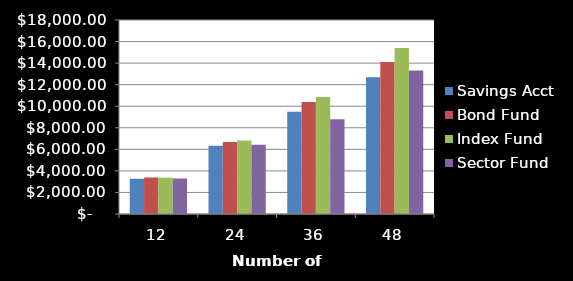
| Category | Savings Acct | Bond Fund | Index Fund | Sector Fund |
|---|---|---|---|---|
| 12.0 | 3270.39 | 3385.88 | 3374.882 | 3295.518 |
| 24.0 | 6340.496 | 6669.879 | 6830.801 | 6417.22 |
| 36.0 | 9476.529 | 10385.981 | 10862.251 | 8788.82 |
| 48.0 | 12695.46 | 14103.137 | 15396.632 | 13311.907 |